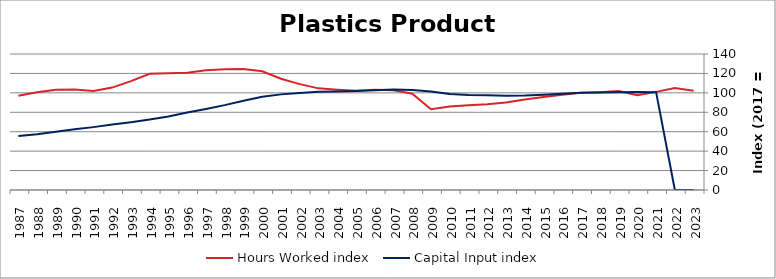
| Category | Hours Worked index | Capital Input index |
|---|---|---|
| 2023.0 | 102.187 | 0 |
| 2022.0 | 104.943 | 0 |
| 2021.0 | 100.994 | 100.718 |
| 2020.0 | 97.466 | 100.93 |
| 2019.0 | 101.832 | 100.698 |
| 2018.0 | 100.751 | 100.43 |
| 2017.0 | 100 | 100 |
| 2016.0 | 97.939 | 99.027 |
| 2015.0 | 95.757 | 98.113 |
| 2014.0 | 93.098 | 97.179 |
| 2013.0 | 90.043 | 96.931 |
| 2012.0 | 88.182 | 97.627 |
| 2011.0 | 87.157 | 97.915 |
| 2010.0 | 85.913 | 98.785 |
| 2009.0 | 83.087 | 101.354 |
| 2008.0 | 99.078 | 102.82 |
| 2007.0 | 102.77 | 103.447 |
| 2006.0 | 103.32 | 102.565 |
| 2005.0 | 102.217 | 101.925 |
| 2004.0 | 103.307 | 101.48 |
| 2003.0 | 104.626 | 101.087 |
| 2002.0 | 109.001 | 99.799 |
| 2001.0 | 114.552 | 98.438 |
| 2000.0 | 122.185 | 95.882 |
| 1999.0 | 124.639 | 91.829 |
| 1998.0 | 124.225 | 87.388 |
| 1997.0 | 123.306 | 83.445 |
| 1996.0 | 120.661 | 79.693 |
| 1995.0 | 120.265 | 75.661 |
| 1994.0 | 119.627 | 72.49 |
| 1993.0 | 112.108 | 69.733 |
| 1992.0 | 105.408 | 67.357 |
| 1991.0 | 101.869 | 64.722 |
| 1990.0 | 103.446 | 62.518 |
| 1989.0 | 103.187 | 59.89 |
| 1988.0 | 100.601 | 57.472 |
| 1987.0 | 96.934 | 55.499 |